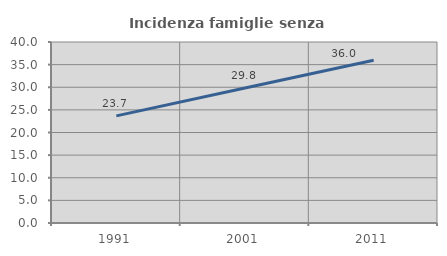
| Category | Incidenza famiglie senza nuclei |
|---|---|
| 1991.0 | 23.674 |
| 2001.0 | 29.835 |
| 2011.0 | 35.951 |